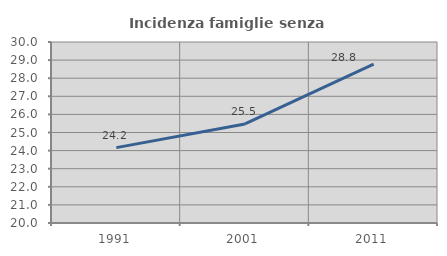
| Category | Incidenza famiglie senza nuclei |
|---|---|
| 1991.0 | 24.165 |
| 2001.0 | 25.475 |
| 2011.0 | 28.774 |